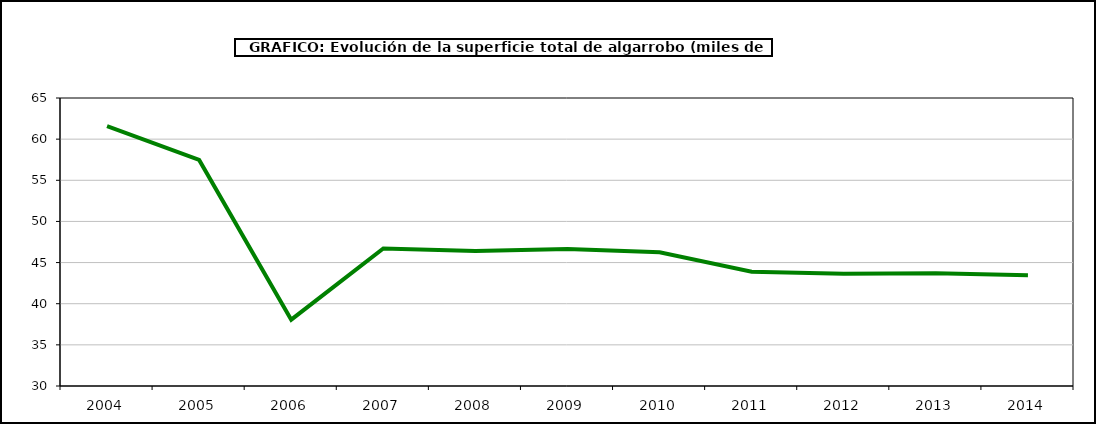
| Category | superficie |
|---|---|
| 2004.0 | 61.586 |
| 2005.0 | 57.48 |
| 2006.0 | 38.058 |
| 2007.0 | 46.708 |
| 2008.0 | 46.404 |
| 2009.0 | 46.656 |
| 2010.0 | 46.243 |
| 2011.0 | 43.883 |
| 2012.0 | 43.647 |
| 2013.0 | 43.695 |
| 2014.0 | 43.447 |